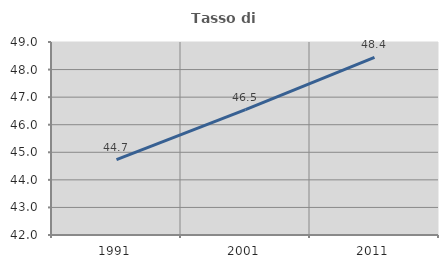
| Category | Tasso di occupazione   |
|---|---|
| 1991.0 | 44.733 |
| 2001.0 | 46.548 |
| 2011.0 | 48.444 |